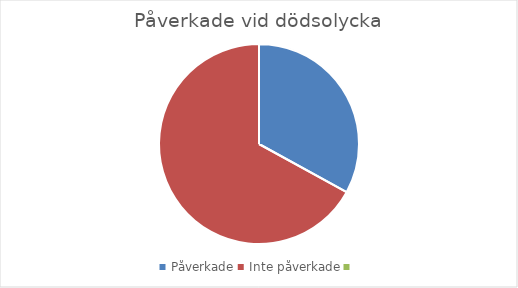
| Category | Antal |
|---|---|
| Påverkade | 33 |
| Inte påverkade | 67 |